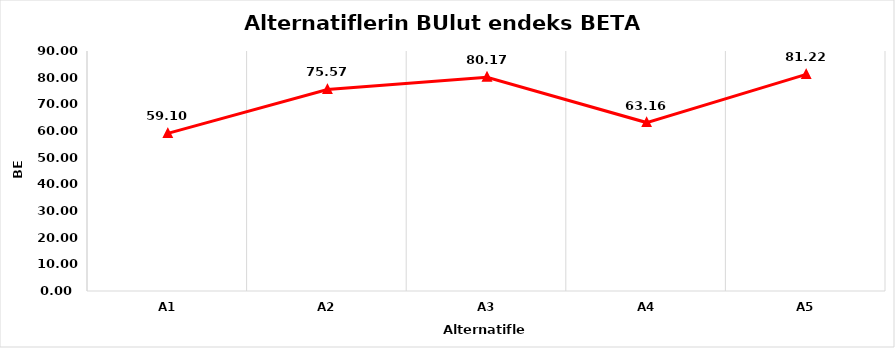
| Category | BE-β  |
|---|---|
| A1 | 59.101 |
| A2 | 75.567 |
| A3 | 80.168 |
| A4 | 63.164 |
| A5 | 81.221 |